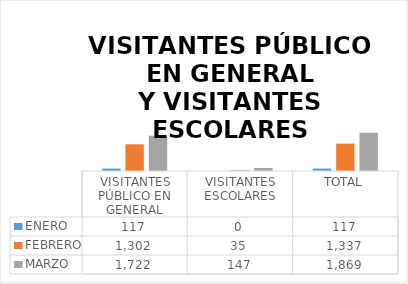
| Category | ENERO | FEBRERO | MARZO |
|---|---|---|---|
| VISITANTES PÚBLICO EN GENERAL | 117 | 1302 | 1722 |
| VISITANTES ESCOLARES | 0 | 35 | 147 |
| TOTAL | 117 | 1337 | 1869 |